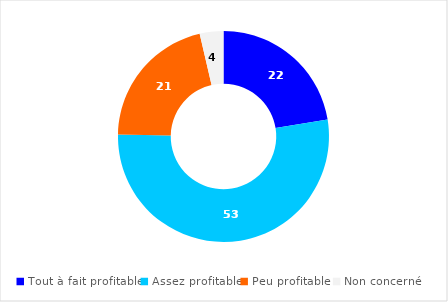
| Category | Series 0 |
|---|---|
| Tout à fait profitable | 22.44 |
| Assez profitable | 52.85 |
| Peu profitable  | 21.07 |
| Non concerné | 3.63 |